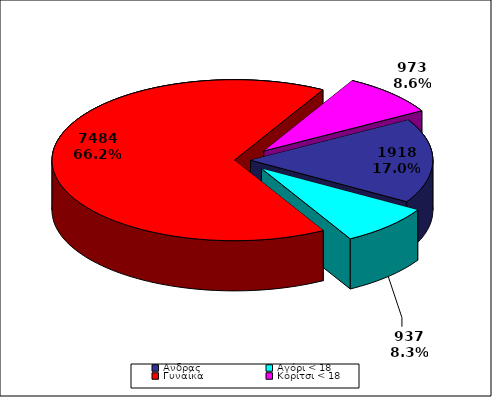
| Category | ΣΥΝΟΛΟ |
|---|---|
| Aνδρας | 1918 |
| Αγόρι < 18 | 937 |
| Γυναίκα | 7484 |
| Κορίτσι < 18 | 973 |